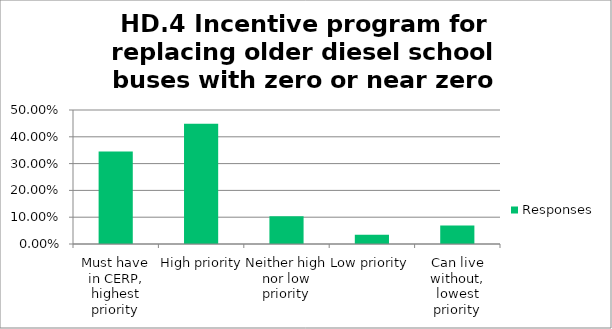
| Category | Responses |
|---|---|
| Must have in CERP, highest priority | 0.345 |
| High priority | 0.448 |
| Neither high nor low priority | 0.103 |
| Low priority | 0.034 |
| Can live without, lowest priority | 0.069 |